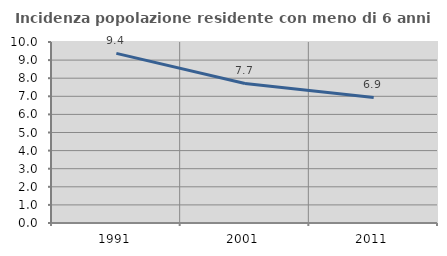
| Category | Incidenza popolazione residente con meno di 6 anni |
|---|---|
| 1991.0 | 9.374 |
| 2001.0 | 7.71 |
| 2011.0 | 6.939 |